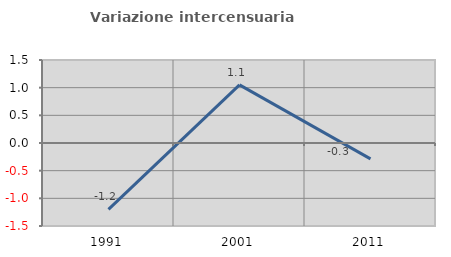
| Category | Variazione intercensuaria annua |
|---|---|
| 1991.0 | -1.198 |
| 2001.0 | 1.05 |
| 2011.0 | -0.287 |